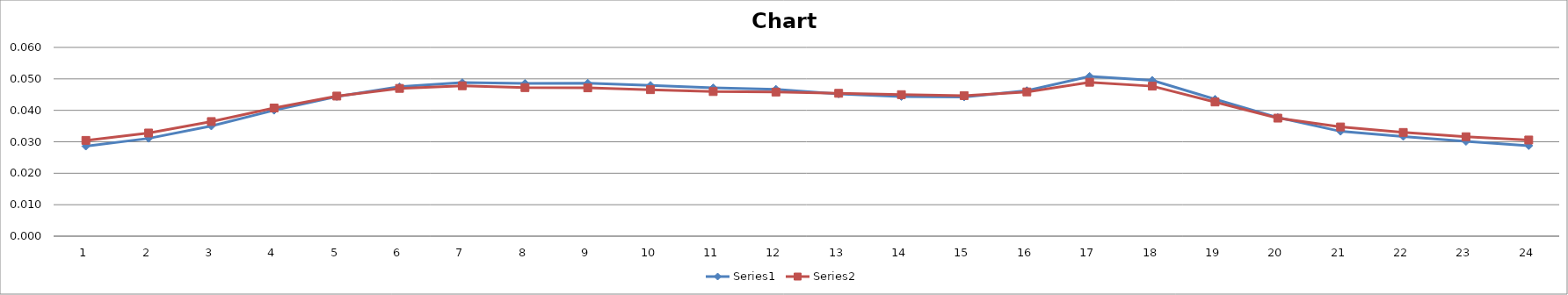
| Category | Series 0 | Series 1 |
|---|---|---|
| 0 | 0.029 | 0.03 |
| 1 | 0.031 | 0.033 |
| 2 | 0.035 | 0.036 |
| 3 | 0.04 | 0.041 |
| 4 | 0.044 | 0.045 |
| 5 | 0.047 | 0.047 |
| 6 | 0.049 | 0.048 |
| 7 | 0.049 | 0.047 |
| 8 | 0.049 | 0.047 |
| 9 | 0.048 | 0.047 |
| 10 | 0.047 | 0.046 |
| 11 | 0.047 | 0.046 |
| 12 | 0.045 | 0.045 |
| 13 | 0.044 | 0.045 |
| 14 | 0.044 | 0.045 |
| 15 | 0.046 | 0.046 |
| 16 | 0.051 | 0.049 |
| 17 | 0.05 | 0.048 |
| 18 | 0.044 | 0.043 |
| 19 | 0.038 | 0.038 |
| 20 | 0.033 | 0.035 |
| 21 | 0.032 | 0.033 |
| 22 | 0.03 | 0.032 |
| 23 | 0.029 | 0.031 |